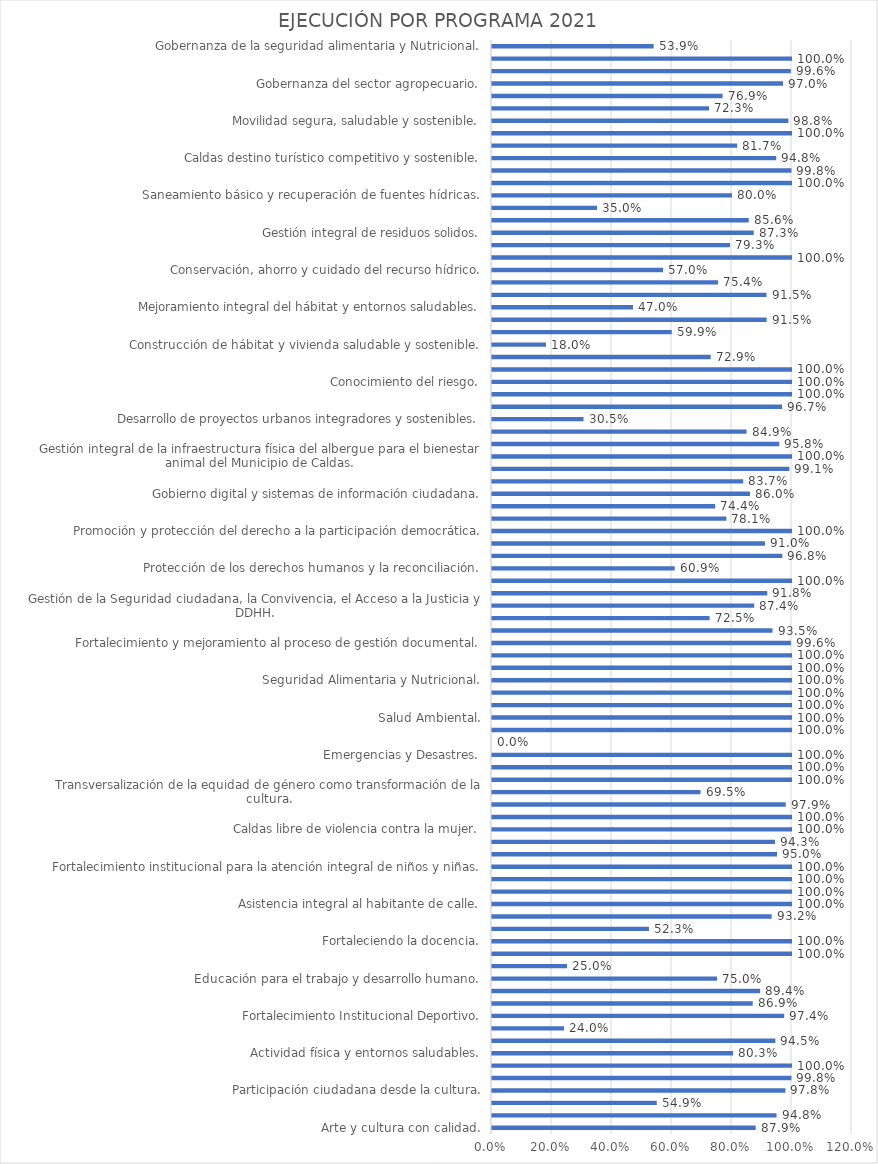
| Category | EJECUCIÓN POR PROGRAMA 2021 |
|---|---|
| Arte y cultura con calidad. | 0.879 |
| Caldas se expresa artística y culturalmente. | 0.948 |
| Infraestructura y equipamiento cultural. | 0.549 |
| Participación ciudadana desde la cultura. | 0.978 |
| Fortalecimiento de la atención integral a victimas. | 0.998 |
| Diversidad con equidad. | 1 |
| Actividad física y entornos saludables. | 0.803 |
| Fomento deportivo. | 0.945 |
| Fortalecimiento a la infraestructura deportiva. | 0.24 |
| Fortalecimiento Institucional Deportivo. | 0.974 |
| Acceso y cobertura educativa. | 0.869 |
| Calidad y pertinencia educativa. | 0.894 |
| Educación para el trabajo y desarrollo humano. | 0.75 |
| Educación rural e incluyente. | 0.25 |
| Fomentado a la educación superior. | 1 |
| Fortaleciendo la docencia. | 1 |
| Permanencia Escolar. | 0.523 |
| Gestión diferencial de poblaciones vulnerables. | 0.932 |
| Asistencia integral al habitante de calle. | 1 |
| La familia, nuestro propósito. | 1 |
| Atención Integral a la primera infancia. | 1 |
| Fortalecimiento institucional para la atención integral de niños y niñas. | 1 |
| Prevención y atención de violencias hacia los niños, niñas y adolescentes. | 0.95 |
| Caldas Joven. | 0.943 |
| Caldas libre de violencia contra la mujer. | 1 |
| Mujeres con calidad de vida. | 1 |
| Mujeres con economía sostenible. | 0.979 |
| Transversalización de la equidad de género como transformación de la cultura. | 0.695 |
| Atención a grupos étnicos con criterios de equidad. | 1 |
| Derechos sexuales y reproductivos. | 1 |
| Emergencias y Desastres. | 1 |
| Fortalecimiento a la infraestructura de salud. | 0 |
| Fortalecimiento de la Autoridad Sanitaria. | 1 |
| Salud Ambiental. | 1 |
| Salud Mental. | 1 |
| Salud y Ámbito Laboral. | 1 |
| Seguridad Alimentaria y Nutricional. | 1 |
| Vida saludable y condiciones no transmisibles. | 1 |
| Vida Saludable y Enfermedades transmisibles. | 1 |
| Fortalecimiento y mejoramiento al proceso de gestión documental. | 0.996 |
| Gestión de la seguridad, salud en el trabajo y bienestar laboral. | 0.935 |
| Modernización institucional y gestión de conocimiento. | 0.725 |
| Gestión de la Seguridad ciudadana, la Convivencia, el Acceso a la Justicia y DDHH. | 0.874 |
| Paz, Reconciliación y Convivencia. | 0.918 |
| Prevención, control y sanción del delito y a sus economías ilegales. | 1 |
| Protección de los derechos humanos y la reconciliación. | 0.609 |
| Construcción participativa y democrática de sociedad. | 0.968 |
| Derecho de libertad religiosa y de cultos. | 0.91 |
| Promoción y protección del derecho a la participación democrática. | 1 |
| Atención oportuna e integral al ciudadano. | 0.781 |
| Eficiencia y eficacia en la gestión presupuestal Municipal. | 0.744 |
| Gobierno digital y sistemas de información ciudadana. | 0.86 |
| Programa de Gestión, Seguimiento y Monitoreo a la gestión pública. | 0.837 |
| Bienestar y protección animal. | 0.991 |
| Gestión integral de la infraestructura física del albergue para el bienestar animal del Municipio de Caldas. | 1 |
| Trato digno y tenencia responsable de los animales. | 0.957 |
| Apoyo y fomento a nuevos sistemas de transporte e integración del transporte intermodal. | 0.848 |
| Desarrollo de proyectos urbanos integradores y sostenibles. | 0.305 |
| Gestión de la Infraestructura física y mejoramiento integral de la malla vial urbana y rural. | 0.967 |
| Gestión permanente ante entidades del orden nacionales, departamentales y regional el Mantenimiento y mejoramiento la malla vial en jurisdicción del Municipio de Caldas. | 1 |
| Conocimiento del riesgo. | 1 |
| Manejo de desastres. | 1 |
| Reducción del riesgo. | 0.729 |
| Construcción de hábitat y vivienda saludable y sostenible. | 0.18 |
| Desarrollo urbano y planeación estratégica del hábitat. | 0.599 |
| Gestión del territorio para el desarrollo sostenible. | 0.915 |
| Mejoramiento integral del hábitat y entornos saludables. | 0.47 |
| Movilidad y gestión territorial. | 0.915 |
| Conservación de Áreas protegidas y ecosistemas estratégicos. | 0.754 |
| Conservación, ahorro y cuidado del recurso hídrico. | 0.57 |
| Educación ambiental, gobernanza de los recursos naturales. | 1 |
| Mitigación y adaptación al cambio climático. | 0.793 |
| Gestión integral de residuos solidos. | 0.872 |
| Gestión integral en la prestación eficiente y eficaz de los servicios públicos domiciliarios. | 0.856 |
| Gobernanza del recurso hídrico. | 0.35 |
| Saneamiento básico y recuperación de fuentes hídricas. | 0.8 |
| Fortalecimiento a la agencia pública de empleo. | 1 |
| Fortalecimiento empresarial y productivo de Caldas. | 0.998 |
| Caldas destino turístico competitivo y sostenible. | 0.948 |
| Planificación turística territorial. | 0.817 |
| Caldas por el empleo y el emprendimiento sostenible. | 1 |
| Movilidad segura, saludable y sostenible. | 0.988 |
| Transporte Público y zonas de estacionamiento regulado. | 0.723 |
| Competitividad agropecuaria. | 0.769 |
| Gobernanza del sector agropecuario. | 0.97 |
| Producción sostenible, conservación de los recursos naturales y corredores biológicos. | 0.996 |
| Transferencia de tecnología para el sector agropecuario. | 1 |
| Gobernanza de la seguridad alimentaria y Nutricional. | 0.539 |